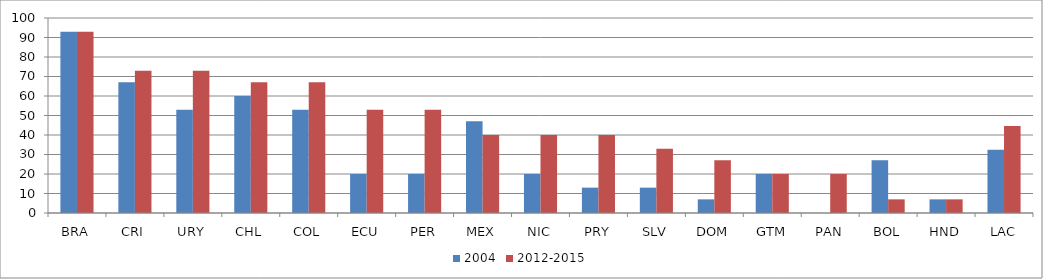
| Category | 2004 | 2012-2015 |
|---|---|---|
| BRA | 93 | 93 |
| CRI | 67 | 73 |
| URY | 53 | 73 |
| CHL | 60 | 67 |
| COL | 53 | 67 |
| ECU | 20 | 53 |
| PER | 20 | 53 |
| MEX | 47 | 40 |
| NIC | 20 | 40 |
| PRY | 13 | 40 |
| SLV | 13 | 33 |
| DOM | 7 | 27 |
| GTM | 20 | 20 |
| PAN | 0 | 20 |
| BOL | 27 | 7 |
| HND | 7 | 7 |
| LAC | 32.5 | 44.562 |